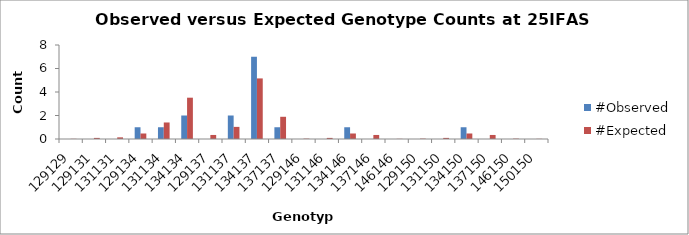
| Category | #Observed | #Expected |
|---|---|---|
| 129129.0 | 0 | 0.016 |
| 129131.0 | 0 | 0.094 |
| 131131.0 | 0 | 0.141 |
| 129134.0 | 1 | 0.469 |
| 131134.0 | 1 | 1.406 |
| 134134.0 | 2 | 3.516 |
| 129137.0 | 0 | 0.344 |
| 131137.0 | 2 | 1.031 |
| 134137.0 | 7 | 5.156 |
| 137137.0 | 1 | 1.891 |
| 129146.0 | 0 | 0.031 |
| 131146.0 | 0 | 0.094 |
| 134146.0 | 1 | 0.469 |
| 137146.0 | 0 | 0.344 |
| 146146.0 | 0 | 0.016 |
| 129150.0 | 0 | 0.031 |
| 131150.0 | 0 | 0.094 |
| 134150.0 | 1 | 0.469 |
| 137150.0 | 0 | 0.344 |
| 146150.0 | 0 | 0.031 |
| 150150.0 | 0 | 0.016 |